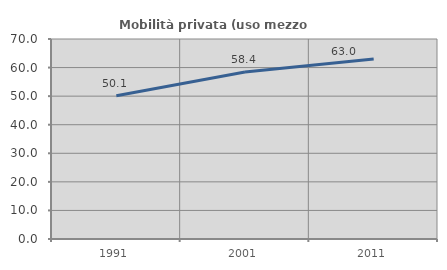
| Category | Mobilità privata (uso mezzo privato) |
|---|---|
| 1991.0 | 50.138 |
| 2001.0 | 58.421 |
| 2011.0 | 63.004 |